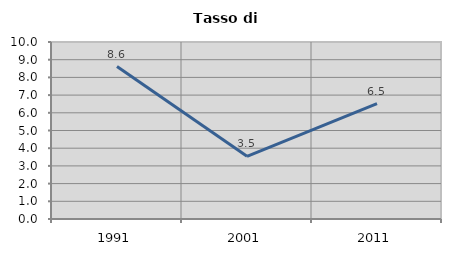
| Category | Tasso di disoccupazione   |
|---|---|
| 1991.0 | 8.61 |
| 2001.0 | 3.54 |
| 2011.0 | 6.522 |